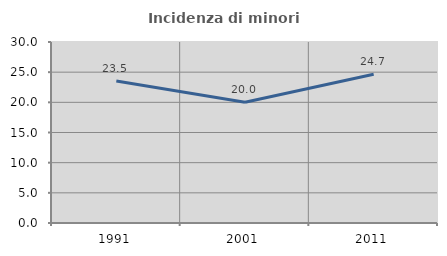
| Category | Incidenza di minori stranieri |
|---|---|
| 1991.0 | 23.529 |
| 2001.0 | 20 |
| 2011.0 | 24.659 |